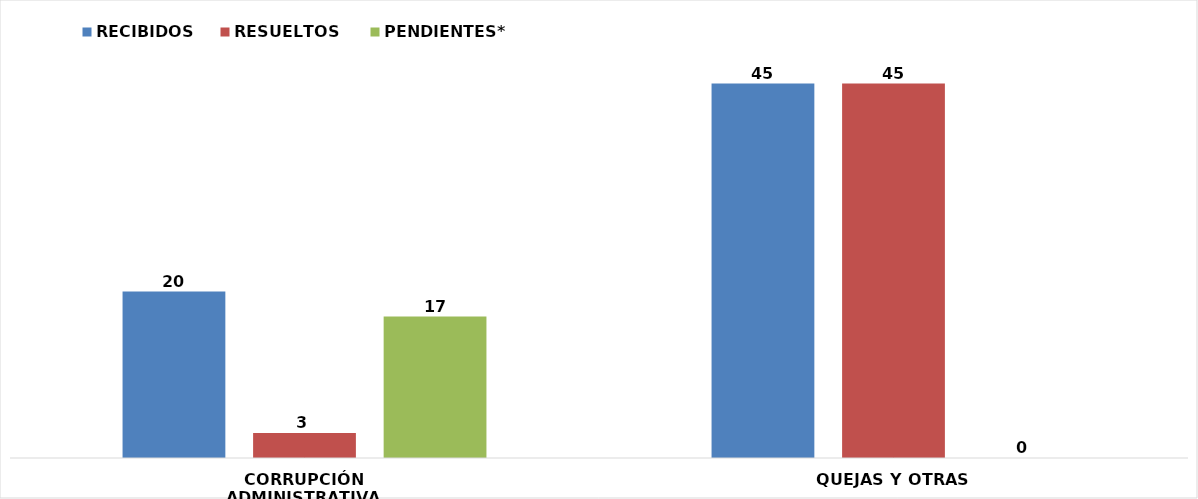
| Category | RECIBIDOS | RESUELTOS  | PENDIENTES* |
|---|---|---|---|
| CORRUPCIÓN ADMINISTRATIVA | 20 | 3 | 17 |
| QUEJAS Y OTRAS | 45 | 45 | 0 |